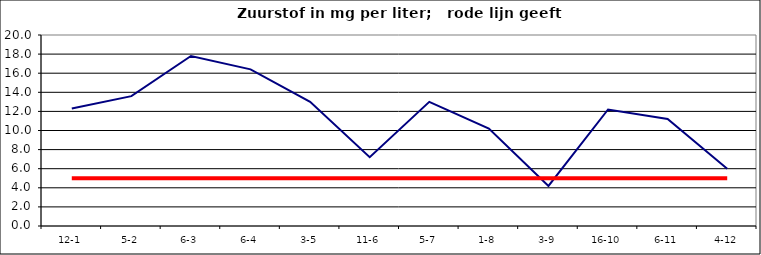
| Category | Series 0 | Series 1 |
|---|---|---|
| 12-1 | 12.3 | 5 |
| 5-2 | 13.6 | 5 |
| 6-3 | 17.8 | 5 |
| 6-4 | 16.4 | 5 |
| 3-5 | 13 | 5 |
| 11-6 | 7.2 | 5 |
| 5-7 | 13 | 5 |
| 1-8 | 10.2 | 5 |
| 3-9 | 4.2 | 5 |
| 16-10 | 12.2 | 5 |
| 6-11 | 11.2 | 5 |
| 4-12 | 6 | 5 |